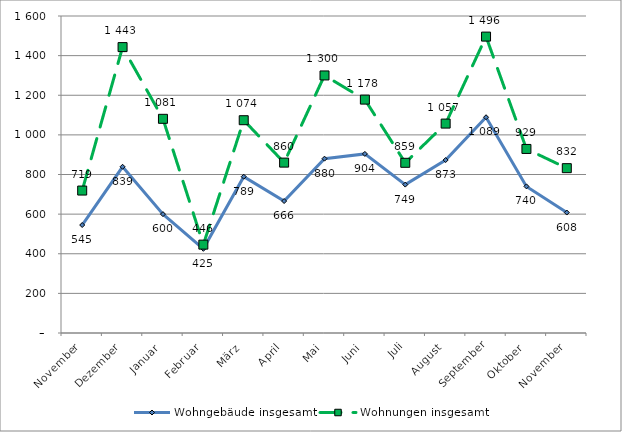
| Category | Wohngebäude insgesamt | Wohnungen insgesamt |
|---|---|---|
| November | 545 | 719 |
| Dezember | 839 | 1443 |
| Januar | 600 | 1081 |
| Februar | 425 | 446 |
| März | 789 | 1074 |
| April | 666 | 860 |
| Mai | 880 | 1300 |
| Juni | 904 | 1178 |
| Juli | 749 | 859 |
| August | 873 | 1057 |
| September | 1089 | 1496 |
| Oktober | 740 | 929 |
| November | 608 | 832 |